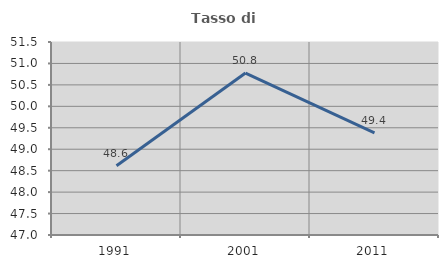
| Category | Tasso di occupazione   |
|---|---|
| 1991.0 | 48.616 |
| 2001.0 | 50.777 |
| 2011.0 | 49.381 |